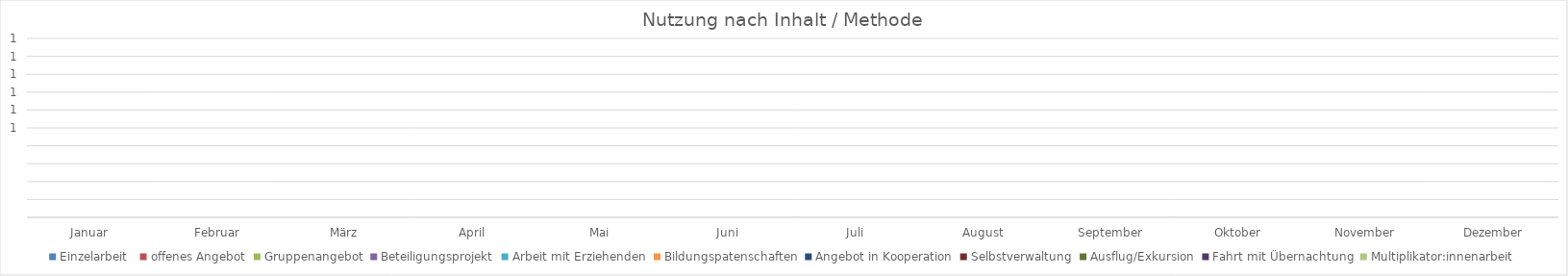
| Category | Einzelarbeit  | offenes Angebot | Gruppenangebot | Beteiligungsprojekt | Arbeit mit Erziehenden | Bildungspatenschaften | Angebot in Kooperation | Selbstverwaltung | Ausflug/Exkursion | Fahrt mit Übernachtung | Multiplikator:innenarbeit |
|---|---|---|---|---|---|---|---|---|---|---|---|
| Januar | 0 | 0 | 0 | 0 | 0 | 0 | 0 | 0 | 0 | 0 | 0 |
| Februar | 0 | 0 | 0 | 0 | 0 | 0 | 0 | 0 | 0 | 0 | 0 |
| März | 0 | 0 | 0 | 0 | 0 | 0 | 0 | 0 | 0 | 0 | 0 |
| April | 0 | 0 | 0 | 0 | 0 | 0 | 0 | 0 | 0 | 0 | 0 |
| Mai | 0 | 0 | 0 | 0 | 0 | 0 | 0 | 0 | 0 | 0 | 0 |
| Juni | 0 | 0 | 0 | 0 | 0 | 0 | 0 | 0 | 0 | 0 | 0 |
| Juli | 0 | 0 | 0 | 0 | 0 | 0 | 0 | 0 | 0 | 0 | 0 |
| August | 0 | 0 | 0 | 0 | 0 | 0 | 0 | 0 | 0 | 0 | 0 |
| September | 0 | 0 | 0 | 0 | 0 | 0 | 0 | 0 | 0 | 0 | 0 |
| Oktober | 0 | 0 | 0 | 0 | 0 | 0 | 0 | 0 | 0 | 0 | 0 |
| November | 0 | 0 | 0 | 0 | 0 | 0 | 0 | 0 | 0 | 0 | 0 |
| Dezember | 0 | 0 | 0 | 0 | 0 | 0 | 0 | 0 | 0 | 0 | 0 |